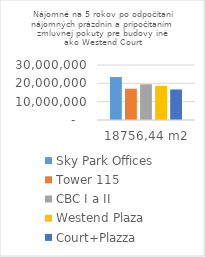
| Category | Sky Park Offices | Tower 115 | CBC I a II | Westend Plaza | Court+Plazza |
|---|---|---|---|---|---|
| 18756,44 m2 | 23435596.01 | 17073489.208 | 19472471.702 | 18594360.8 | 16656566.69 |